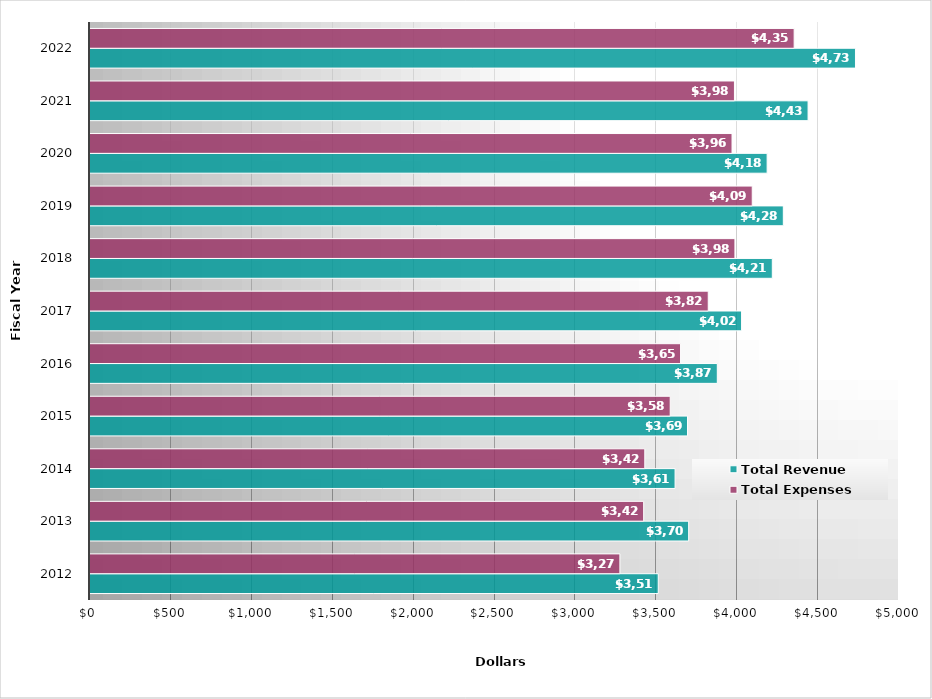
| Category | Total Revenue | Total Expenses |
|---|---|---|
| 2012.0 | 3512 | 3275 |
| 2013.0 | 3700 | 3422 |
| 2014.0 | 3616 | 3429 |
| 2015.0 | 3693 | 3586 |
| 2016.0 | 3877 | 3650 |
| 2017.0 | 4027 | 3821 |
| 2018.0 | 4217 | 3986 |
| 2019.0 | 4285 | 4093 |
| 2020.0 | 4185 | 3968 |
| 2021.0 | 4438 | 3983 |
| 2022.0 | 4731 | 4352 |